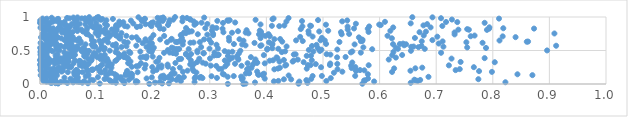
| Category | Series 0 |
|---|---|
| 0.3591591293108423 | 0.001 |
| 0.3318553778098888 | 0.002 |
| 0.19310288330263442 | 0.003 |
| 0.5695654694388664 | 0.004 |
| 0.4567258419210277 | 0.005 |
| 0.36323679229386574 | 0.006 |
| 0.03210194724669446 | 0.007 |
| 0.105530511758227 | 0.008 |
| 0.2158178270936792 | 0.009 |
| 0.22781219331394056 | 0.01 |
| 0.08473429610001029 | 0.011 |
| 0.027268120653331267 | 0.012 |
| 0.45707477554645 | 0.013 |
| 0.14895310987676486 | 0.014 |
| 0.02038912557778603 | 0.015 |
| 0.04816745839160288 | 0.016 |
| 0.47252988938196044 | 0.017 |
| 0.6550110184047855 | 0.018 |
| 0.13414531002284466 | 0.019 |
| 0.0746708667991731 | 0.02 |
| 0.2032698478440046 | 0.021 |
| 0.01829148550884203 | 0.022 |
| 0.379845467197882 | 0.023 |
| 0.029505858187101074 | 0.024 |
| 0.058605217174458164 | 0.025 |
| 0.822289353091718 | 0.026 |
| 0.16929650222418738 | 0.027 |
| 0.2730792903845866 | 0.028 |
| 0.21152817728549594 | 0.029 |
| 0.03677775987859141 | 0.03 |
| 0.06909195755650503 | 0.031 |
| 0.12787768870560112 | 0.032 |
| 0.019435069277822334 | 0.033 |
| 0.1720313962706333 | 0.034 |
| 0.011673553650673971 | 0.035 |
| 0.45823897738909986 | 0.036 |
| 0.06550208457661369 | 0.037 |
| 0.5903570467520098 | 0.038 |
| 0.04334078731456225 | 0.039 |
| 0.41320514070580694 | 0.04 |
| 0.1249291054703758 | 0.041 |
| 0.16991422256086505 | 0.042 |
| 0.24887237855520067 | 0.043 |
| 0.07825861365051419 | 0.044 |
| 0.5059229186251024 | 0.045 |
| 0.4211191538597055 | 0.046 |
| 0.6672323044138766 | 0.047 |
| 0.05745562042087266 | 0.048 |
| 0.005856418952116011 | 0.049 |
| 0.02673436729158429 | 0.05 |
| 0.14792695576419843 | 0.051 |
| 0.5743493374622101 | 0.052 |
| 0.572669355771039 | 0.053 |
| 0.007781261174729774 | 0.054 |
| 0.663242178377394 | 0.055 |
| 0.12317974999051466 | 0.056 |
| 0.09405073549686062 | 0.057 |
| 0.47055355400868043 | 0.058 |
| 0.14470189814834175 | 0.059 |
| 0.6717070601430835 | 0.06 |
| 0.24112651752145958 | 0.061 |
| 0.15704195982769142 | 0.062 |
| 0.06454664191639226 | 0.063 |
| 0.6613999903950707 | 0.064 |
| 0.0894847432955092 | 0.065 |
| 0.019542217354576834 | 0.066 |
| 0.06317576993562657 | 0.067 |
| 0.3569249067557028 | 0.068 |
| 0.4437350897064723 | 0.069 |
| 0.43091067105766245 | 0.07 |
| 0.23308408051368856 | 0.071 |
| 0.7744910081762203 | 0.072 |
| 0.026910899125206493 | 0.073 |
| 0.11405208828600577 | 0.074 |
| 0.004544977482878481 | 0.075 |
| 0.4791382699260462 | 0.076 |
| 0.05374730075828275 | 0.077 |
| 0.010294174163578756 | 0.078 |
| 0.13453618112440682 | 0.079 |
| 0.39704467121301956 | 0.08 |
| 0.11751363113845353 | 0.081 |
| 0.5795477077901479 | 0.082 |
| 0.18836139868095408 | 0.083 |
| 0.2195758872813762 | 0.084 |
| 0.35818805643841534 | 0.085 |
| 0.2471419960735343 | 0.086 |
| 0.2733559399655926 | 0.087 |
| 0.5137355574159027 | 0.088 |
| 0.2870337127659924 | 0.089 |
| 0.14097516296636767 | 0.09 |
| 0.31262304293577436 | 0.091 |
| 0.22000363122158023 | 0.092 |
| 0.06609395513298158 | 0.093 |
| 0.2822519645226045 | 0.094 |
| 0.04314952924320602 | 0.095 |
| 0.22638939903096428 | 0.096 |
| 0.16245588125606725 | 0.097 |
| 0.21341786080396374 | 0.098 |
| 0.19754683012245425 | 0.099 |
| 0.06680813204887767 | 0.1 |
| 0.1428236716641718 | 0.101 |
| 0.10233083817220906 | 0.102 |
| 0.27482406547752103 | 0.103 |
| 0.2541374502006056 | 0.104 |
| 0.24511874624693916 | 0.105 |
| 0.28426783127790534 | 0.106 |
| 0.6863469917476416 | 0.107 |
| 0.33162023600162144 | 0.108 |
| 0.007502571684709026 | 0.109 |
| 0.35535305749363344 | 0.11 |
| 0.13560161248800476 | 0.111 |
| 0.22844037176707038 | 0.112 |
| 0.003479403543279959 | 0.113 |
| 0.22976685707435426 | 0.114 |
| 0.21462821788348854 | 0.115 |
| 0.30305602896747846 | 0.116 |
| 0.08082110827080821 | 0.117 |
| 0.34230204459633673 | 0.118 |
| 0.4816816016987726 | 0.119 |
| 0.4979935656997899 | 0.12 |
| 0.5568699116520011 | 0.121 |
| 0.020858533808990505 | 0.122 |
| 0.01569741737687492 | 0.123 |
| 0.21825225577768115 | 0.124 |
| 0.1600272311237861 | 0.125 |
| 0.08382096735431956 | 0.126 |
| 0.4393192770092306 | 0.127 |
| 0.13539850719454266 | 0.128 |
| 0.029910812431693298 | 0.129 |
| 0.3938344080806711 | 0.13 |
| 0.0012539497685145656 | 0.131 |
| 0.869973531764865 | 0.132 |
| 0.15090478901599844 | 0.133 |
| 0.061117174069644876 | 0.134 |
| 0.08574578360481311 | 0.135 |
| 0.023381163627881563 | 0.136 |
| 0.38650962375391323 | 0.137 |
| 0.02418969894463571 | 0.138 |
| 0.1544674541519928 | 0.139 |
| 0.39294352790229947 | 0.14 |
| 0.16303042594548106 | 0.141 |
| 0.32503112260994277 | 0.142 |
| 0.38530424664643276 | 0.143 |
| 0.11968792407357762 | 0.144 |
| 0.8435681674161782 | 0.145 |
| 0.5792930811457574 | 0.146 |
| 0.13211072497140866 | 0.147 |
| 0.11622113531906127 | 0.148 |
| 0.009982979804600268 | 0.149 |
| 0.06126588942041429 | 0.15 |
| 0.32295995849206255 | 0.151 |
| 0.23236546350745363 | 0.152 |
| 0.23538071726626686 | 0.153 |
| 0.3956602806779873 | 0.154 |
| 0.015089725876601264 | 0.155 |
| 0.36351653808300727 | 0.156 |
| 0.16100154993732477 | 0.157 |
| 0.23778801192370505 | 0.158 |
| 0.15210618645102894 | 0.159 |
| 0.3695323245498441 | 0.16 |
| 0.1535223723952809 | 0.161 |
| 0.02792259545745035 | 0.162 |
| 0.028810728836957664 | 0.163 |
| 0.00900011157620383 | 0.164 |
| 0.36937174698747305 | 0.165 |
| 0.010423912148740283 | 0.166 |
| 0.1260899303397065 | 0.167 |
| 0.5193192468658199 | 0.168 |
| 0.06746528750637366 | 0.169 |
| 0.022896464829396054 | 0.17 |
| 0.27639076664581197 | 0.171 |
| 0.10794326637118254 | 0.172 |
| 0.06017919325078002 | 0.173 |
| 0.018467070760252478 | 0.174 |
| 0.00802242224181539 | 0.175 |
| 0.1724906523955675 | 0.176 |
| 0.04924855933621326 | 0.177 |
| 0.07518636649363072 | 0.178 |
| 0.06804084407673969 | 0.179 |
| 0.622030127982818 | 0.18 |
| 0.7984482340277295 | 0.181 |
| 0.009615243496700114 | 0.182 |
| 0.2524156173139151 | 0.183 |
| 0.5341713470876971 | 0.184 |
| 0.038057112053635656 | 0.185 |
| 0.3836522448741051 | 0.186 |
| 0.10556301514882818 | 0.187 |
| 0.19993609103831655 | 0.188 |
| 0.08406163627357431 | 0.189 |
| 0.12430207226691807 | 0.19 |
| 0.021131255353915024 | 0.191 |
| 0.7757334982226216 | 0.192 |
| 0.02506296015774454 | 0.193 |
| 0.27146782609180997 | 0.194 |
| 0.001794603554224979 | 0.195 |
| 0.1539197732999545 | 0.196 |
| 0.558173170719651 | 0.197 |
| 0.6545075269853221 | 0.198 |
| 0.2605550031408923 | 0.199 |
| 0.040381001548119015 | 0.2 |
| 0.5591995463556259 | 0.201 |
| 0.36753028646852764 | 0.202 |
| 0.032039112152517896 | 0.203 |
| 0.5730323586246309 | 0.204 |
| 0.11504803179179532 | 0.205 |
| 0.06352569096378177 | 0.206 |
| 0.7343741959659751 | 0.207 |
| 0.5654371267590793 | 0.208 |
| 0.06495515802233989 | 0.209 |
| 0.20610812458762207 | 0.21 |
| 0.0008690179921967597 | 0.211 |
| 0.09080273776362857 | 0.212 |
| 0.09168176237066038 | 0.213 |
| 0.0933126248722898 | 0.214 |
| 0.09334127371581515 | 0.215 |
| 0.08297105605415593 | 0.216 |
| 0.03613688455472472 | 0.217 |
| 0.025684120890465043 | 0.218 |
| 0.41405075809011666 | 0.219 |
| 0.5256213281335579 | 0.22 |
| 0.36589954360039206 | 0.221 |
| 0.7415874378878968 | 0.222 |
| 0.2348106718091419 | 0.223 |
| 0.32058900336833557 | 0.224 |
| 0.017029658056191 | 0.225 |
| 0.2694720434163809 | 0.226 |
| 0.31598265406630793 | 0.227 |
| 0.10422600784407196 | 0.228 |
| 0.47131484188996314 | 0.229 |
| 0.42039373917344125 | 0.23 |
| 0.023343498939295194 | 0.231 |
| 0.185037935480011 | 0.232 |
| 0.6257271109552099 | 0.233 |
| 0.6632155679922063 | 0.234 |
| 0.009911146828288083 | 0.235 |
| 0.36895708061845167 | 0.236 |
| 0.03640509195710518 | 0.237 |
| 0.5505916804225213 | 0.238 |
| 0.03958222807045353 | 0.239 |
| 0.10111124548197373 | 0.24 |
| 0.37365589293078383 | 0.241 |
| 0.42386783841477815 | 0.242 |
| 0.12621695563878066 | 0.243 |
| 0.6753316541930834 | 0.244 |
| 0.24708571632660228 | 0.245 |
| 0.21447684717511858 | 0.246 |
| 0.011099383243579525 | 0.247 |
| 0.05448401619521831 | 0.248 |
| 0.03234836875018818 | 0.249 |
| 0.4965736662055104 | 0.25 |
| 0.7665282979585907 | 0.251 |
| 0.19828819257852512 | 0.252 |
| 0.5571070495539039 | 0.253 |
| 0.0013950400580622923 | 0.254 |
| 0.04977745410322264 | 0.255 |
| 0.042648782914577334 | 0.256 |
| 0.1621486748944779 | 0.257 |
| 0.0029215701820844136 | 0.258 |
| 0.22612920478264564 | 0.259 |
| 0.10643680836350597 | 0.26 |
| 0.209944072562699 | 0.261 |
| 0.10668948242879572 | 0.262 |
| 0.055024820017208174 | 0.263 |
| 0.3273742343982785 | 0.264 |
| 0.17017616471647798 | 0.265 |
| 0.11905341173908872 | 0.266 |
| 0.08004916867786367 | 0.267 |
| 0.07429201609470244 | 0.268 |
| 0.07838979691448728 | 0.269 |
| 0.3113648782038216 | 0.27 |
| 0.17421043066871528 | 0.271 |
| 0.356022820470913 | 0.272 |
| 0.5496910995603236 | 0.273 |
| 0.30182628658265204 | 0.274 |
| 0.4332875887543155 | 0.275 |
| 0.2146838346200591 | 0.276 |
| 0.08243043201366398 | 0.277 |
| 0.7224204157967336 | 0.278 |
| 0.0702960710833616 | 0.279 |
| 0.5806763044765795 | 0.28 |
| 0.4779903622513048 | 0.281 |
| 0.4733803190553308 | 0.282 |
| 0.5122236032587415 | 0.283 |
| 0.434949205188027 | 0.284 |
| 0.1865223178489575 | 0.285 |
| 0.26915554561720306 | 0.286 |
| 0.008281666469928523 | 0.287 |
| 0.37598753744539454 | 0.288 |
| 9.282871111568244e-05 | 0.289 |
| 0.22543091686523659 | 0.29 |
| 0.047615035284107286 | 0.291 |
| 0.12677372445229282 | 0.292 |
| 0.26542797357135633 | 0.293 |
| 0.11026768381111417 | 0.294 |
| 0.12303686447197275 | 0.295 |
| 0.2717244310201431 | 0.296 |
| 0.4872143874434286 | 0.297 |
| 0.014998112148065635 | 0.298 |
| 0.3309247141604568 | 0.299 |
| 0.5252903705827696 | 0.3 |
| 0.08592517946518198 | 0.301 |
| 0.34453913997625246 | 0.302 |
| 0.2928302935855221 | 0.303 |
| 0.025782986115702004 | 0.304 |
| 0.15792332673406612 | 0.305 |
| 0.5128618203272796 | 0.306 |
| 0.047904477478173696 | 0.307 |
| 0.3971137953441142 | 0.308 |
| 0.05932643086728225 | 0.309 |
| 0.36673047133278946 | 0.31 |
| 0.17841874024402837 | 0.311 |
| 0.1557426690901118 | 0.312 |
| 0.0016573724294092135 | 0.313 |
| 0.23924925270143652 | 0.314 |
| 0.040451222896148276 | 0.315 |
| 0.382927140383568 | 0.316 |
| 0.07022051092688865 | 0.317 |
| 0.3839300662685388 | 0.318 |
| 0.2873352985336017 | 0.319 |
| 0.07879938123879515 | 0.32 |
| 0.551722045748814 | 0.321 |
| 0.03322524774069356 | 0.322 |
| 0.028684195281160174 | 0.323 |
| 0.044022456002414674 | 0.324 |
| 0.8034880650562087 | 0.325 |
| 0.4657868239906371 | 0.326 |
| 0.2775179215131008 | 0.327 |
| 0.006776145924708277 | 0.328 |
| 0.7431754883799625 | 0.329 |
| 0.37951995482205525 | 0.33 |
| 0.04354268192753479 | 0.331 |
| 0.20551242457180025 | 0.332 |
| 0.018963848567574527 | 0.333 |
| 0.42312837308924117 | 0.334 |
| 0.44644353355339705 | 0.335 |
| 0.07091422998201839 | 0.336 |
| 0.15983429047777614 | 0.337 |
| 0.0507232209357201 | 0.338 |
| 0.20834780991179663 | 0.339 |
| 0.11680568068331507 | 0.34 |
| 0.12063402671621143 | 0.341 |
| 0.07094590563870892 | 0.342 |
| 0.013831004665607785 | 0.343 |
| 0.0035308592488550224 | 0.344 |
| 0.13317370881067647 | 0.345 |
| 0.0693847181020014 | 0.346 |
| 0.09019116250798306 | 0.347 |
| 0.405657487735706 | 0.348 |
| 0.44807092337172455 | 0.349 |
| 0.061842339026920795 | 0.35 |
| 0.32656363241071984 | 0.351 |
| 0.2665796829201988 | 0.352 |
| 0.026010297339287298 | 0.353 |
| 0.41164960215590535 | 0.354 |
| 0.48017854470294935 | 0.355 |
| 0.1350813046901903 | 0.356 |
| 2.465986303402437e-05 | 0.357 |
| 0.4308477622735671 | 0.358 |
| 0.017735082494047347 | 0.359 |
| 0.09121896634586647 | 0.36 |
| 0.026411919756830802 | 0.361 |
| 0.3344896781990799 | 0.362 |
| 0.3504500215146556 | 0.363 |
| 0.45548193597979064 | 0.364 |
| 0.6161599886723909 | 0.365 |
| 0.039784064371643606 | 0.366 |
| 0.3806311633531205 | 0.367 |
| 0.011500197303064723 | 0.368 |
| 0.046897675973072074 | 0.369 |
| 0.03222775242789401 | 0.37 |
| 0.10716745422865813 | 0.371 |
| 0.24555199653323972 | 0.372 |
| 0.11051091510380723 | 0.373 |
| 0.08556417950454338 | 0.374 |
| 0.2493870840114189 | 0.375 |
| 0.11024748129342171 | 0.376 |
| 0.11866006375981937 | 0.377 |
| 0.28138036375689246 | 0.378 |
| 0.7271050333415422 | 0.379 |
| 0.349901171219233 | 0.38 |
| 0.300364246947786 | 0.381 |
| 0.0022543594544581647 | 0.382 |
| 0.03666460992575814 | 0.383 |
| 0.15550258060897357 | 0.384 |
| 0.419416434351382 | 0.385 |
| 0.7855863666421851 | 0.386 |
| 0.15348768458318673 | 0.387 |
| 0.187638935269198 | 0.388 |
| 0.050545987508820577 | 0.389 |
| 0.21094123549651983 | 0.39 |
| 0.013940073337975175 | 0.391 |
| 0.3399011663448863 | 0.392 |
| 0.012223845851880875 | 0.393 |
| 0.628710872838565 | 0.394 |
| 0.13947295795760525 | 0.395 |
| 0.17784738393833877 | 0.396 |
| 0.41792727687317144 | 0.397 |
| 0.5249014668176626 | 0.398 |
| 0.26267019385542373 | 0.399 |
| 0.10106788423976484 | 0.4 |
| 0.3726305082388183 | 0.401 |
| 0.14831082832154457 | 0.402 |
| 0.5399157640707822 | 0.403 |
| 0.1827015129568549 | 0.404 |
| 0.15191790408332476 | 0.405 |
| 0.029463088323514044 | 0.406 |
| 0.07969614113962978 | 0.407 |
| 0.0019462861281562545 | 0.408 |
| 0.19915190172038727 | 0.409 |
| 0.09304656751382874 | 0.41 |
| 0.057991565361881915 | 0.411 |
| 0.04418272302336774 | 0.412 |
| 0.18847380759112164 | 0.413 |
| 0.004553908436402614 | 0.414 |
| 0.3480036888485717 | 0.415 |
| 0.05848310348769365 | 0.416 |
| 0.07814883236873192 | 0.417 |
| 0.3320912084095977 | 0.418 |
| 0.0933887451444005 | 0.419 |
| 0.4712446635174452 | 0.42 |
| 0.011640444978299773 | 0.421 |
| 0.47881662829788146 | 0.422 |
| 0.1462007610212214 | 0.423 |
| 0.3072110868260062 | 0.424 |
| 0.14131605480873788 | 0.425 |
| 0.02757193761590377 | 0.426 |
| 0.10694367430007382 | 0.427 |
| 0.0049707022876938015 | 0.428 |
| 0.6222773874795935 | 0.429 |
| 0.3121161031177432 | 0.43 |
| 0.3954639356879344 | 0.431 |
| 0.31469612107403155 | 0.432 |
| 0.6398342796983464 | 0.433 |
| 0.06177679237686366 | 0.434 |
| 0.1144468126315669 | 0.435 |
| 0.04821639393626425 | 0.436 |
| 0.31570744903612635 | 0.437 |
| 0.31433190468811956 | 0.438 |
| 0.5131163407653341 | 0.439 |
| 0.0009090357624129064 | 0.44 |
| 0.44839556670039404 | 0.441 |
| 0.2579055414674793 | 0.442 |
| 0.4516418608172453 | 0.443 |
| 0.030862232835586256 | 0.444 |
| 0.5063872483718611 | 0.445 |
| 0.09655712938919418 | 0.446 |
| 0.2669130750977213 | 0.447 |
| 0.0068085095819052375 | 0.448 |
| 0.049092064471198016 | 0.449 |
| 0.2579282687784581 | 0.45 |
| 0.08378168585514656 | 0.451 |
| 0.24030647161200888 | 0.452 |
| 0.13810156881026162 | 0.453 |
| 0.14899222456640365 | 0.454 |
| 0.09824860784135171 | 0.455 |
| 0.35127409231796114 | 0.456 |
| 0.011869347450650023 | 0.457 |
| 0.2887392452063732 | 0.458 |
| 0.28944464931473224 | 0.459 |
| 0.0777339696282694 | 0.46 |
| 0.09532672676154995 | 0.461 |
| 0.23492067509332007 | 0.462 |
| 0.05685601561191574 | 0.463 |
| 0.15959774558959014 | 0.464 |
| 0.21917041433385873 | 0.465 |
| 0.7086266182755395 | 0.466 |
| 0.05601061634750466 | 0.467 |
| 0.5667984205791331 | 0.468 |
| 0.22900308842089634 | 0.469 |
| 0.30830164161537627 | 0.47 |
| 0.04287301998091112 | 0.471 |
| 0.5491194245773929 | 0.472 |
| 0.27805659551050116 | 0.473 |
| 0.3329947631502878 | 0.474 |
| 0.13369095271973233 | 0.475 |
| 0.42729794693740525 | 0.476 |
| 0.1972063740028331 | 0.477 |
| 0.07973459113990067 | 0.478 |
| 0.6245119836728237 | 0.479 |
| 0.0007063665372547094 | 0.48 |
| 0.002043420920853102 | 0.481 |
| 0.33996143083605557 | 0.482 |
| 0.15748477293469848 | 0.483 |
| 0.1772599765263029 | 0.484 |
| 0.4830301382166949 | 0.485 |
| 0.5519179178231215 | 0.486 |
| 0.4331541263539292 | 0.487 |
| 0.022585145535253502 | 0.488 |
| 0.008701806197407125 | 0.489 |
| 0.07382193919786999 | 0.49 |
| 0.32637484389457216 | 0.491 |
| 0.19296404673927472 | 0.492 |
| 0.4944997682625274 | 0.493 |
| 0.0865578778888084 | 0.494 |
| 0.6553815861432037 | 0.495 |
| 0.35395375601454426 | 0.496 |
| 0.12324695400176558 | 0.497 |
| 0.27814791643066233 | 0.498 |
| 0.08007123288050971 | 0.499 |
| 0.06293105261387735 | 0.5 |
| 0.8959265124848426 | 0.501 |
| 0.01935545422234062 | 0.502 |
| 0.034417928521661534 | 0.503 |
| 0.08055706458523759 | 0.504 |
| 0.10412463319015454 | 0.505 |
| 0.2258626638259193 | 0.506 |
| 0.016640340219396553 | 0.507 |
| 0.47496659513989203 | 0.508 |
| 0.1986493948411332 | 0.509 |
| 0.1130696053287833 | 0.51 |
| 0.07240332362475127 | 0.511 |
| 0.4971755717480001 | 0.512 |
| 0.24292232913388834 | 0.513 |
| 0.4013434337800305 | 0.514 |
| 0.525274745034712 | 0.515 |
| 0.028952528811863984 | 0.516 |
| 0.056665038622929396 | 0.517 |
| 0.0019724336179196608 | 0.518 |
| 0.586925657354799 | 0.519 |
| 0.05705687955455194 | 0.52 |
| 0.26273165553165234 | 0.521 |
| 0.2410678648660944 | 0.522 |
| 0.24587614127399726 | 0.523 |
| 0.6797745110000758 | 0.524 |
| 0.6323974661993232 | 0.525 |
| 0.4209447613381681 | 0.526 |
| 0.4016843695129506 | 0.527 |
| 0.2995188924348452 | 0.528 |
| 0.13538989391008266 | 0.529 |
| 0.05191891290406207 | 0.53 |
| 0.3143306626989211 | 0.531 |
| 0.23586748552338715 | 0.532 |
| 0.015329443394659725 | 0.533 |
| 0.4102548550367987 | 0.534 |
| 0.49102865054050887 | 0.535 |
| 0.007923293841385496 | 0.536 |
| 0.11426325121137516 | 0.537 |
| 0.787999674299143 | 0.538 |
| 0.06583292427454054 | 0.539 |
| 0.00033219372105394794 | 0.54 |
| 0.07694616451117846 | 0.541 |
| 0.20114770298526669 | 0.542 |
| 0.23274668923166758 | 0.543 |
| 0.6283661141376642 | 0.544 |
| 0.059736065752027605 | 0.545 |
| 0.7547609510417684 | 0.546 |
| 0.5712994765820925 | 0.547 |
| 0.19213632519926888 | 0.548 |
| 0.04361220963204945 | 0.549 |
| 0.6686964802221507 | 0.55 |
| 0.2847246634932586 | 0.551 |
| 0.144150754533056 | 0.552 |
| 0.18818315826316478 | 0.553 |
| 0.10869169498897681 | 0.554 |
| 0.6557385499544802 | 0.555 |
| 0.09747352296535246 | 0.556 |
| 0.7127297801987835 | 0.557 |
| 0.09410601745511796 | 0.558 |
| 0.660078278188688 | 0.559 |
| 0.43567370236110226 | 0.56 |
| 0.19292655726346064 | 0.561 |
| 0.028221259978524836 | 0.562 |
| 0.1527194105671423 | 0.563 |
| 0.09637489077850735 | 0.564 |
| 0.06604440614222329 | 0.565 |
| 0.03455210993917645 | 0.566 |
| 0.4805585988954842 | 0.567 |
| 0.6740133794649442 | 0.568 |
| 0.03675771689440429 | 0.569 |
| 0.3892727015330458 | 0.57 |
| 0.9119037753970233 | 0.571 |
| 0.17016095556843466 | 0.572 |
| 0.13352375326270075 | 0.573 |
| 0.01131026246340044 | 0.574 |
| 0.04635808705177321 | 0.575 |
| 0.36314824821116004 | 0.576 |
| 0.3912749593649383 | 0.577 |
| 0.6433566801708464 | 0.578 |
| 0.015525372516810377 | 0.579 |
| 0.01356848741025049 | 0.58 |
| 0.1286894094676757 | 0.581 |
| 0.0561818980282998 | 0.582 |
| 0.004089136834431902 | 0.583 |
| 0.4885075946195928 | 0.584 |
| 0.41021801040990186 | 0.585 |
| 0.3118606402903484 | 0.586 |
| 0.018688155828061815 | 0.587 |
| 0.0914610310794637 | 0.588 |
| 0.2522078431401181 | 0.589 |
| 0.35716686931071295 | 0.59 |
| 0.5558560361600534 | 0.591 |
| 0.08046400533619034 | 0.592 |
| 0.6467903900929314 | 0.593 |
| 0.13406950994569422 | 0.594 |
| 0.6237197485308807 | 0.595 |
| 0.342669838995659 | 0.596 |
| 0.6357794219871385 | 0.597 |
| 0.505449496395869 | 0.598 |
| 0.108323361067935 | 0.599 |
| 0.011068023151292914 | 0.6 |
| 0.013060262718340902 | 0.601 |
| 0.41064851716878814 | 0.602 |
| 0.6414483547193718 | 0.603 |
| 0.7044809229528799 | 0.604 |
| 0.19780498625711226 | 0.605 |
| 0.05050563458078678 | 0.606 |
| 0.02090926293843925 | 0.607 |
| 0.024817212734762478 | 0.608 |
| 0.0478968562017356 | 0.609 |
| 0.18133672366698642 | 0.61 |
| 0.028428214060963526 | 0.611 |
| 0.0717479409772879 | 0.612 |
| 0.37896470714800934 | 0.613 |
| 0.0010765873600720721 | 0.614 |
| 0.7819145552971373 | 0.615 |
| 0.26566079236797463 | 0.616 |
| 0.30241417065132525 | 0.617 |
| 0.19348500720087178 | 0.618 |
| 0.27135363476589747 | 0.619 |
| 0.1549388397942444 | 0.62 |
| 0.12015311284232137 | 0.621 |
| 0.40459308829824564 | 0.622 |
| 0.753281176912544 | 0.623 |
| 0.2244086091834727 | 0.624 |
| 0.282464030618038 | 0.625 |
| 0.24226651771994895 | 0.626 |
| 0.5290685816247552 | 0.627 |
| 0.1489225295703079 | 0.628 |
| 0.23972543510429023 | 0.629 |
| 0.05556007011583847 | 0.63 |
| 0.8600679016776775 | 0.631 |
| 0.4279804018777715 | 0.632 |
| 0.8623221439063016 | 0.633 |
| 0.09552090984517526 | 0.634 |
| 0.07197827285010766 | 0.635 |
| 0.7113192958359899 | 0.636 |
| 0.6744799674999119 | 0.637 |
| 0.24632536316987927 | 0.638 |
| 0.5669063601006312 | 0.639 |
| 0.25273866980704945 | 0.64 |
| 0.4642132690416224 | 0.641 |
| 0.5694358206341665 | 0.642 |
| 0.018530790170782324 | 0.643 |
| 0.1869048852439062 | 0.644 |
| 0.10519940882751162 | 0.645 |
| 0.359524212536566 | 0.646 |
| 0.06693996837298587 | 0.647 |
| 0.3341520592612838 | 0.648 |
| 0.8118524168418421 | 0.649 |
| 0.5031083486333147 | 0.65 |
| 0.4524468632219533 | 0.651 |
| 0.49555811449865994 | 0.652 |
| 0.1131364652097268 | 0.653 |
| 0.09184663433326037 | 0.654 |
| 0.6932942829735156 | 0.655 |
| 0.04309984958794696 | 0.656 |
| 0.17413161221048917 | 0.657 |
| 0.013981731357801093 | 0.658 |
| 0.23118961961628387 | 0.659 |
| 0.06256011257147576 | 0.66 |
| 0.5697963661006998 | 0.661 |
| 0.2989518564947739 | 0.662 |
| 0.5676578331728561 | 0.663 |
| 0.21231343145253448 | 0.664 |
| 0.289836541606426 | 0.665 |
| 0.058841339297908093 | 0.666 |
| 0.18626688992398094 | 0.667 |
| 0.35243059675035987 | 0.668 |
| 0.4141137482126371 | 0.669 |
| 0.00878945841171354 | 0.67 |
| 0.4243119474164136 | 0.671 |
| 0.056260501009157936 | 0.672 |
| 0.04982098514055402 | 0.673 |
| 0.23270748378064332 | 0.674 |
| 0.024754579152501396 | 0.675 |
| 0.1416017219551085 | 0.676 |
| 0.11755979292175209 | 0.677 |
| 0.056504053238726135 | 0.678 |
| 0.06905662717096715 | 0.679 |
| 0.028210161278482526 | 0.68 |
| 0.037660256694193824 | 0.681 |
| 0.6217487178145543 | 0.682 |
| 0.19598676717996075 | 0.683 |
| 0.3896707684471681 | 0.684 |
| 0.010345294565516716 | 0.685 |
| 0.1398689300628267 | 0.686 |
| 0.6623983864378429 | 0.687 |
| 0.25055555005441305 | 0.688 |
| 0.49804938317926095 | 0.689 |
| 0.030145722604635085 | 0.69 |
| 0.3337402779769075 | 0.691 |
| 0.029622933870343936 | 0.692 |
| 0.1211204593891095 | 0.693 |
| 0.1623786992911609 | 0.694 |
| 0.031766113570740655 | 0.695 |
| 0.5634465744756397 | 0.696 |
| 0.0017911773887091982 | 0.697 |
| 0.1702820345306487 | 0.698 |
| 0.8402399806512507 | 0.699 |
| 0.14176642967057657 | 0.7 |
| 0.049093599845078335 | 0.701 |
| 0.09054740945870375 | 0.702 |
| 0.45965312993643254 | 0.703 |
| 0.05775918673238472 | 0.704 |
| 0.04761195950925257 | 0.705 |
| 0.701968743632835 | 0.706 |
| 0.018953533640416534 | 0.707 |
| 0.48166012110359335 | 0.708 |
| 0.02596939834087137 | 0.709 |
| 0.05246516845124636 | 0.71 |
| 0.8174477048456654 | 0.711 |
| 0.1394287035920616 | 0.712 |
| 0.7609736404207716 | 0.713 |
| 0.406092717338784 | 0.714 |
| 0.04725162426259586 | 0.715 |
| 0.01079343204208752 | 0.716 |
| 0.21940287388496235 | 0.717 |
| 0.3982491908056763 | 0.718 |
| 0.15263478844469655 | 0.719 |
| 0.6139924308590659 | 0.72 |
| 0.10296098678959824 | 0.721 |
| 0.13445833407943208 | 0.722 |
| 0.7678379154112503 | 0.723 |
| 0.6779412594278197 | 0.724 |
| 0.014267651950955404 | 0.725 |
| 0.1246556502825488 | 0.726 |
| 0.011404687990085514 | 0.727 |
| 0.3057464900143819 | 0.728 |
| 0.2487002366227282 | 0.729 |
| 0.20042077883754186 | 0.73 |
| 0.05329074255367823 | 0.731 |
| 0.24991274533822175 | 0.732 |
| 0.13426147306103786 | 0.733 |
| 0.00863779072129379 | 0.734 |
| 0.01842459145730094 | 0.735 |
| 0.006001942528082088 | 0.736 |
| 0.2956269461494728 | 0.737 |
| 0.3913723058127683 | 0.738 |
| 0.0851625285296338 | 0.739 |
| 0.7325125652414114 | 0.74 |
| 0.3869649416933218 | 0.741 |
| 0.5329855510161653 | 0.742 |
| 0.27883133130809606 | 0.743 |
| 0.4037246496568543 | 0.744 |
| 0.08204850617337614 | 0.745 |
| 0.04601061670445609 | 0.746 |
| 0.5461626141206476 | 0.747 |
| 0.027696211943122107 | 0.748 |
| 0.30585148585881455 | 0.749 |
| 0.004704540593447626 | 0.75 |
| 0.4748335842890915 | 0.751 |
| 0.11557794223175707 | 0.752 |
| 0.02693363384087963 | 0.753 |
| 0.9088577549197241 | 0.754 |
| 0.008027934605261765 | 0.755 |
| 0.368283406173818 | 0.756 |
| 0.046733389245513186 | 0.757 |
| 0.2578675976945814 | 0.758 |
| 0.1301694063601529 | 0.759 |
| 0.14397443843978572 | 0.76 |
| 0.09836172431320181 | 0.761 |
| 0.10477443731164587 | 0.762 |
| 0.12043240571282533 | 0.763 |
| 0.05041265169156261 | 0.764 |
| 0.33925492304786986 | 0.765 |
| 0.046335845423884685 | 0.766 |
| 0.3634537095770857 | 0.767 |
| 0.25446198774531176 | 0.768 |
| 0.038989280484990306 | 0.769 |
| 0.7325710476733155 | 0.77 |
| 0.10350982566512808 | 0.771 |
| 0.3240735238191917 | 0.772 |
| 0.6705467168518426 | 0.773 |
| 0.5317609518667387 | 0.774 |
| 0.019431285077048645 | 0.775 |
| 0.0575254826074496 | 0.776 |
| 0.5804798512843562 | 0.777 |
| 0.3905318619516453 | 0.778 |
| 0.26364778920090143 | 0.779 |
| 0.025517642696416595 | 0.78 |
| 0.6818270296583288 | 0.781 |
| 0.051659504336335586 | 0.782 |
| 0.07593633111403773 | 0.783 |
| 0.4933515394936227 | 0.784 |
| 0.13335814029461154 | 0.785 |
| 0.2681130104048323 | 0.786 |
| 0.11073940127500802 | 0.787 |
| 0.34988273589793617 | 0.788 |
| 0.4742839373600119 | 0.789 |
| 0.10932310000344977 | 0.79 |
| 0.06594221594320583 | 0.791 |
| 0.10673006641249504 | 0.792 |
| 0.007199797544665294 | 0.793 |
| 0.6189875296566528 | 0.794 |
| 0.5091829984312048 | 0.795 |
| 0.30396073883153885 | 0.796 |
| 0.26158468970198756 | 0.797 |
| 0.388276933380324 | 0.798 |
| 0.08225676765288843 | 0.799 |
| 0.04213675651102346 | 0.8 |
| 0.10170175912208328 | 0.801 |
| 0.01474612547407484 | 0.802 |
| 0.3649928533264451 | 0.803 |
| 0.13555575606831083 | 0.804 |
| 0.031634930918824536 | 0.805 |
| 0.006128408906033959 | 0.806 |
| 0.010792055130797092 | 0.807 |
| 0.7896640799131224 | 0.808 |
| 0.019232962177201912 | 0.809 |
| 0.7577454334028295 | 0.81 |
| 0.7391737236379821 | 0.811 |
| 0.07306081612313518 | 0.812 |
| 0.543666259455111 | 0.813 |
| 0.12706703524044674 | 0.814 |
| 0.010237442758990477 | 0.815 |
| 0.09944696544070449 | 0.816 |
| 0.04658793473279695 | 0.817 |
| 0.21832812378447136 | 0.818 |
| 0.7547485381711849 | 0.819 |
| 0.46070430648454846 | 0.82 |
| 0.017986472432788208 | 0.821 |
| 0.11537280205379824 | 0.822 |
| 0.03190556508906706 | 0.823 |
| 0.5790855916054876 | 0.824 |
| 0.3225103296271112 | 0.825 |
| 0.7934405920053934 | 0.826 |
| 0.8728649096638612 | 0.827 |
| 0.21202398904835404 | 0.828 |
| 0.5548044642422337 | 0.829 |
| 0.006285166628475696 | 0.83 |
| 0.02337524283782528 | 0.831 |
| 0.8185302088065955 | 0.832 |
| 0.2920294271243611 | 0.833 |
| 0.08333795345346356 | 0.834 |
| 0.2581292031835182 | 0.835 |
| 0.3117534548888935 | 0.836 |
| 0.0660131254099308 | 0.837 |
| 0.048897802377257944 | 0.838 |
| 0.03711050756748982 | 0.839 |
| 0.0008816120859086653 | 0.84 |
| 0.06251890261406119 | 0.841 |
| 0.0331582750871336 | 0.842 |
| 0.09494661033074348 | 0.843 |
| 0.6240369006417195 | 0.844 |
| 0.690107857234494 | 0.845 |
| 0.793889801681416 | 0.846 |
| 0.1358034404927236 | 0.847 |
| 0.30483684338068856 | 0.848 |
| 0.09710165343147925 | 0.849 |
| 0.008421523673244363 | 0.85 |
| 0.17121011111469334 | 0.851 |
| 0.09447561445629483 | 0.852 |
| 0.05276795681043949 | 0.853 |
| 0.13416456570990914 | 0.854 |
| 0.10524541593496684 | 0.855 |
| 0.0990179023069909 | 0.856 |
| 0.5434835749159559 | 0.857 |
| 0.1545175499974739 | 0.858 |
| 0.5816040847558804 | 0.859 |
| 0.46362964501681103 | 0.86 |
| 0.09206514331553567 | 0.861 |
| 0.17718562153893816 | 0.862 |
| 0.19674807693385202 | 0.863 |
| 0.42272216328516504 | 0.864 |
| 0.14979122950457935 | 0.865 |
| 0.7108592177816687 | 0.866 |
| 0.47881618191499764 | 0.867 |
| 0.40970763931783805 | 0.868 |
| 0.2105383994713013 | 0.869 |
| 0.04806413274577399 | 0.87 |
| 0.47737766905897044 | 0.871 |
| 0.08951194608404481 | 0.872 |
| 0.43160437253860673 | 0.873 |
| 0.0031365416664932183 | 0.874 |
| 0.6774599125442498 | 0.875 |
| 0.014937285681197374 | 0.876 |
| 0.11846823033865735 | 0.877 |
| 0.13460900101034082 | 0.878 |
| 0.6019931732848159 | 0.879 |
| 0.22619804322645667 | 0.88 |
| 0.20759951202894708 | 0.881 |
| 0.04437368246912527 | 0.882 |
| 0.06501472132002464 | 0.883 |
| 0.2729461709572324 | 0.884 |
| 0.5051918811278396 | 0.885 |
| 0.14065537355492094 | 0.886 |
| 0.5993265771115751 | 0.887 |
| 0.043426782461586995 | 0.888 |
| 0.38961350033765757 | 0.889 |
| 0.08011186010759073 | 0.89 |
| 0.19414455614252055 | 0.891 |
| 0.013325982252666395 | 0.892 |
| 0.18667628612483964 | 0.893 |
| 0.6840200546177811 | 0.894 |
| 0.05623102311879853 | 0.895 |
| 0.2955975294256351 | 0.896 |
| 0.11493179905982577 | 0.897 |
| 0.14074202128374008 | 0.898 |
| 0.5581077591084037 | 0.899 |
| 0.07009359170988679 | 0.9 |
| 0.06323676375867676 | 0.901 |
| 0.06154837552094366 | 0.902 |
| 0.16484208477998946 | 0.903 |
| 0.03481185622990977 | 0.904 |
| 0.6549444231930761 | 0.905 |
| 0.2759909832286888 | 0.906 |
| 0.09942832728420324 | 0.907 |
| 0.016276501763771097 | 0.908 |
| 0.017565988271754415 | 0.909 |
| 0.03714387438689793 | 0.91 |
| 0.323327952854261 | 0.911 |
| 5.472871083677638e-05 | 0.912 |
| 0.7855901946209873 | 0.913 |
| 0.19737916221270188 | 0.914 |
| 0.2854291212992317 | 0.915 |
| 0.08974549141909932 | 0.916 |
| 0.01114645417711646 | 0.917 |
| 0.3448397379873365 | 0.918 |
| 0.22800942780369637 | 0.919 |
| 0.20030418127720548 | 0.92 |
| 0.001706918876026971 | 0.921 |
| 0.1471691995448796 | 0.922 |
| 0.0873980156461988 | 0.923 |
| 0.7372623322646894 | 0.924 |
| 0.21013473776787545 | 0.925 |
| 0.7174297454454365 | 0.926 |
| 0.04350128079780852 | 0.927 |
| 0.6095014817096834 | 0.928 |
| 0.009312436588304343 | 0.929 |
| 0.02278449816045674 | 0.93 |
| 0.14011672583479387 | 0.931 |
| 0.4353291333232604 | 0.932 |
| 0.004142267040067766 | 0.933 |
| 0.271533989055886 | 0.934 |
| 0.5339075893152149 | 0.935 |
| 0.25154107075069515 | 0.936 |
| 0.180726730409013 | 0.937 |
| 0.002950408887020258 | 0.938 |
| 0.4628939799161331 | 0.939 |
| 0.02913002843927442 | 0.94 |
| 0.2167368611098047 | 0.941 |
| 0.3133025162443497 | 0.942 |
| 0.332769340299518 | 0.943 |
| 0.21187437407741289 | 0.944 |
| 0.08688861491631068 | 0.945 |
| 0.1606899087551815 | 0.946 |
| 0.00031825886105129805 | 0.947 |
| 0.08081793887245849 | 0.948 |
| 0.5428099950590518 | 0.949 |
| 0.3310423071013593 | 0.95 |
| 0.11739904506705758 | 0.951 |
| 0.3352178952178615 | 0.952 |
| 0.22894976487415258 | 0.953 |
| 0.49122746133565653 | 0.954 |
| 0.06148648825308634 | 0.955 |
| 0.1791209283542341 | 0.956 |
| 0.023283011059747543 | 0.957 |
| 0.3809097228520208 | 0.958 |
| 0.10774526083491197 | 0.959 |
| 0.23539843640017724 | 0.96 |
| 0.0655639240476647 | 0.961 |
| 0.7277858900711366 | 0.962 |
| 0.265404183674417 | 0.963 |
| 0.09505571170119408 | 0.964 |
| 0.2652695921118621 | 0.965 |
| 0.10524935214044692 | 0.966 |
| 0.4107610438043112 | 0.967 |
| 0.18484427579104595 | 0.968 |
| 0.031069909665932264 | 0.969 |
| 0.1101109061656164 | 0.97 |
| 0.12882116150136783 | 0.971 |
| 0.03214589779625239 | 0.972 |
| 0.21891688039967225 | 0.973 |
| 0.18536648786191043 | 0.974 |
| 0.012002709409384082 | 0.975 |
| 0.8109727709803876 | 0.976 |
| 0.00468634234428885 | 0.977 |
| 0.412689181461813 | 0.978 |
| 0.07382417600136928 | 0.979 |
| 0.05226008683241168 | 0.98 |
| 0.07957000142782499 | 0.981 |
| 0.7085213843391776 | 0.982 |
| 0.21315600391641085 | 0.983 |
| 0.43914076476451336 | 0.984 |
| 0.25961185128372444 | 0.985 |
| 0.04784205531084078 | 0.986 |
| 0.20770686023048457 | 0.987 |
| 0.2521326874479819 | 0.988 |
| 0.020653249471002475 | 0.989 |
| 0.10029411962698262 | 0.99 |
| 0.2901138612721312 | 0.991 |
| 0.05895022524089529 | 0.992 |
| 0.217587514188003 | 0.993 |
| 0.06622882836670904 | 0.994 |
| 0.6933825463286751 | 0.995 |
| 0.1738928041653134 | 0.996 |
| 0.6578377167555897 | 0.997 |
| 0.08691678283972575 | 0.998 |
| 0.2386243631219559 | 0.999 |
| 0.1030058389928072 | 1 |